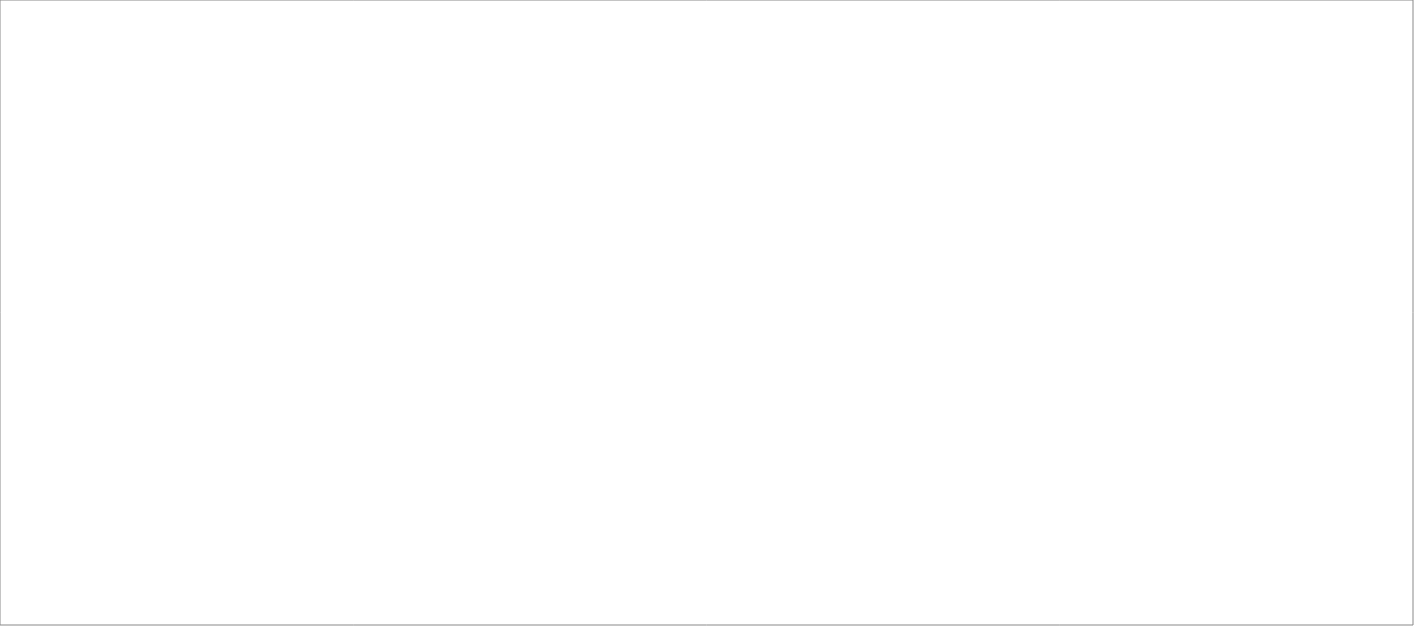
| Category | Total |
|---|---|
| Poolia Sverige AB | 85 |
| Randstad AB | 80 |
| Experis AB | 45 |
| Signpost AB | 25 |
| Source Executive Recruitment Sweden AB | 25 |